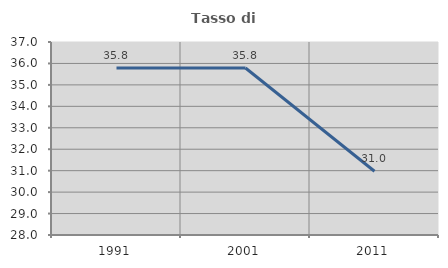
| Category | Tasso di occupazione   |
|---|---|
| 1991.0 | 35.793 |
| 2001.0 | 35.789 |
| 2011.0 | 30.974 |